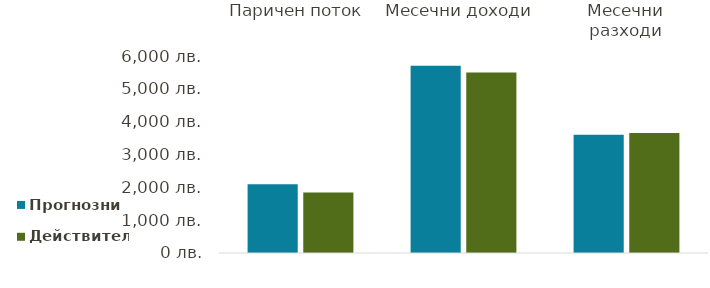
| Category | Прогнозни | Действителни |
|---|---|---|
| Паричен поток | 2097 | 1845 |
| Месечни доходи | 5700 | 5500 |
| Месечни разходи | 3603 | 3655 |